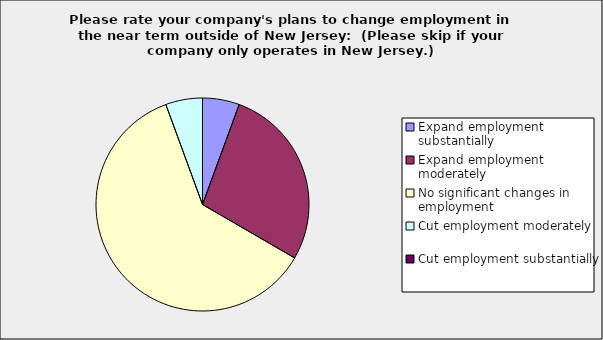
| Category | Series 0 |
|---|---|
| Expand employment substantially | 0.056 |
| Expand employment moderately | 0.278 |
| No significant changes in employment | 0.611 |
| Cut employment moderately | 0.056 |
| Cut employment substantially | 0 |